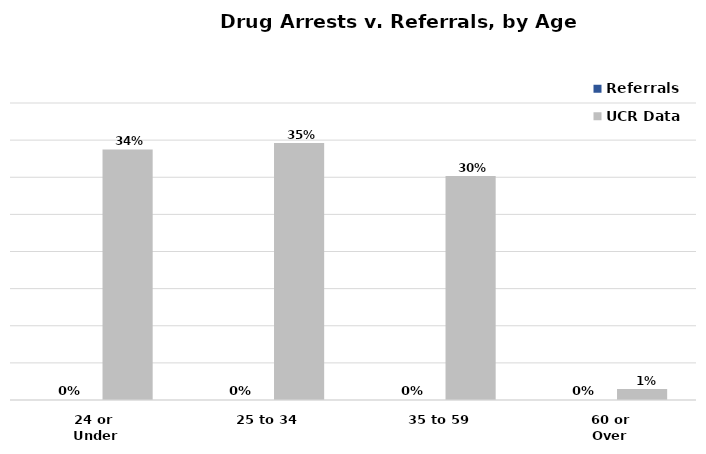
| Category | Referrals | UCR Data |
|---|---|---|
| 24 or 
Under | 0 | 0.337 |
| 25 to 34 | 0 | 0.346 |
| 35 to 59 | 0 | 0.302 |
| 60 or
Over | 0 | 0.015 |